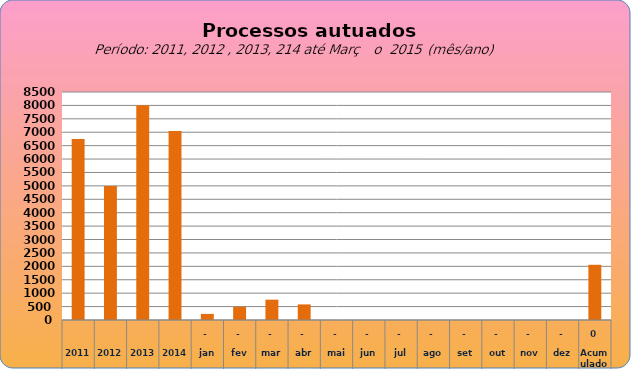
| Category | 6749 4998 8003 7049  228   488   758   581   -     -     -     -     -     -     -     -     2.055  |
|---|---|
| 2011 | 6749 |
| 2012 | 4998 |
| 2013 | 8003 |
| 2014 | 7049 |
| jan | 228 |
| fev | 491 |
| mar | 758 |
| abr | 581 |
| mai | 0 |
| jun | 0 |
| jul | 0 |
| ago | 0 |
| set | 0 |
| out | 0 |
| nov | 0 |
| dez | 0 |
| Acumulado
 | 2058 |